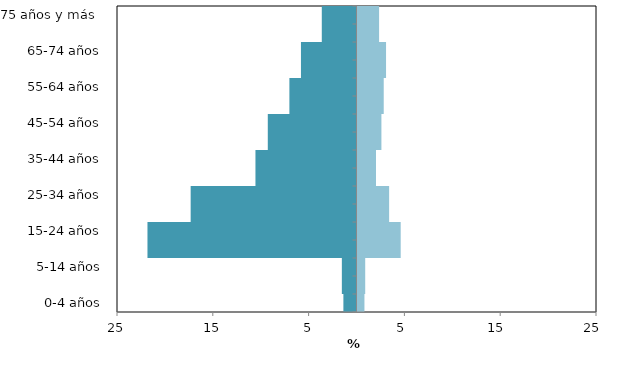
| Category | Varones | Mujeres |
|---|---|---|
| 0-4 años | -1.369 | 0.725 |
|  | -1.53 | 0.805 |
| 5-14 años | -1.53 | 0.805 |
|  | -21.82 | 4.509 |
| 15-24 años | -21.82 | 4.509 |
|  | -17.311 | 3.301 |
| 25-34 años | -17.311 | 3.301 |
|  | -10.548 | 1.932 |
| 35-44 años | -10.548 | 1.932 |
|  | -9.259 | 2.496 |
| 45-54 años | -9.259 | 2.496 |
|  | -7.005 | 2.738 |
| 55-64 años | -7.005 | 2.738 |
|  | -5.797 | 2.979 |
| 65-74 años | -5.797 | 2.979 |
|  | -3.623 | 2.254 |
| 75 años y más  | -3.623 | 2.254 |